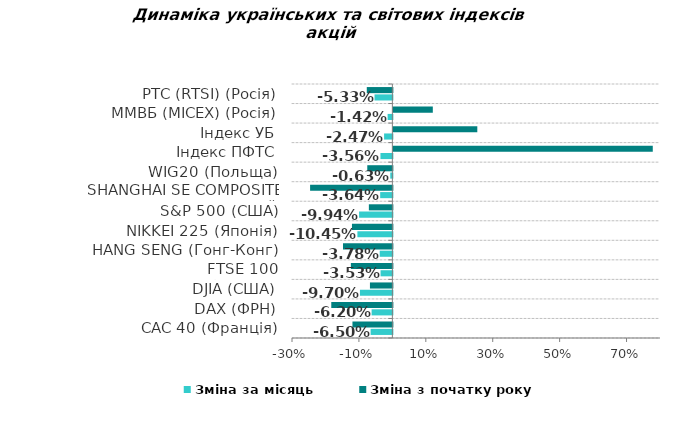
| Category | Зміна за місяць | Зміна з початку року |
|---|---|---|
| CAC 40 (Франція) | -0.065 | -0.119 |
| DAX (ФРН) | -0.062 | -0.183 |
| DJIA (США) | -0.097 | -0.067 |
| FTSE 100  (Великобританія) | -0.035 | -0.124 |
| HANG SENG (Гонг-Конг) | -0.038 | -0.148 |
| NIKKEI 225 (Японія) | -0.105 | -0.121 |
| S&P 500 (США) | -0.099 | -0.07 |
| SHANGHAI SE COMPOSITE (Китай) | -0.036 | -0.246 |
| WIG20 (Польща) | -0.006 | -0.075 |
| Індекс ПФТС | -0.036 | 0.775 |
| Індекс УБ | -0.025 | 0.251 |
| ММВБ (MICEX) (Росія) | -0.014 | 0.118 |
| РТС (RTSI) (Росія) | -0.053 | -0.076 |